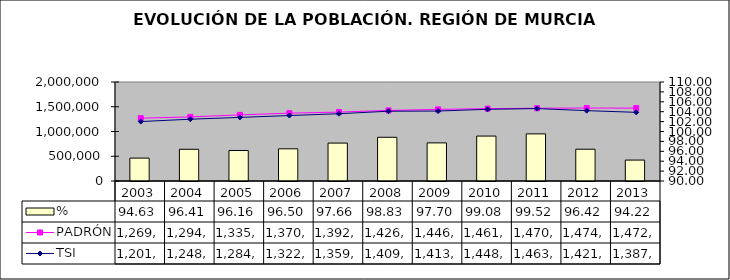
| Category | % |
|---|---|
| 2003.0 | 94.627 |
| 2004.0 | 96.407 |
| 2005.0 | 96.163 |
| 2006.0 | 96.501 |
| 2007.0 | 97.658 |
| 2008.0 | 98.831 |
| 2009.0 | 97.699 |
| 2010.0 | 99.076 |
| 2011.0 | 99.52 |
| 2012.0 | 96.418 |
| 2013.0 | 94.225 |